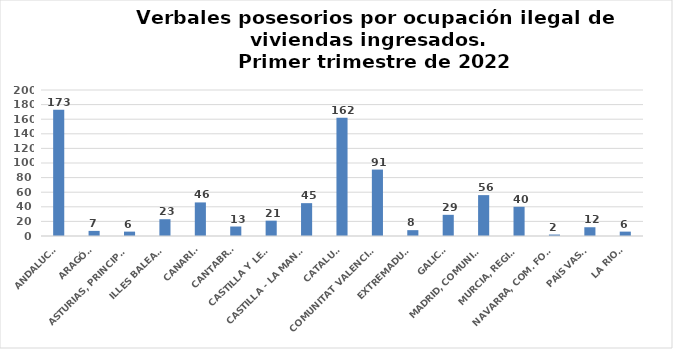
| Category | Series 0 |
|---|---|
| ANDALUCÍA | 173 |
| ARAGÓN | 7 |
| ASTURIAS, PRINCIPADO | 6 |
| ILLES BALEARS | 23 |
| CANARIAS | 46 |
| CANTABRIA | 13 |
| CASTILLA Y LEÓN | 21 |
| CASTILLA - LA MANCHA | 45 |
| CATALUÑA | 162 |
| COMUNITAT VALENCIANA | 91 |
| EXTREMADURA | 8 |
| GALICIA | 29 |
| MADRID, COMUNIDAD | 56 |
| MURCIA, REGIÓN | 40 |
| NAVARRA, COM. FORAL | 2 |
| PAÍS VASCO | 12 |
| LA RIOJA | 6 |